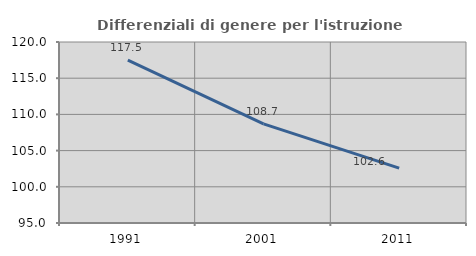
| Category | Differenziali di genere per l'istruzione superiore |
|---|---|
| 1991.0 | 117.499 |
| 2001.0 | 108.683 |
| 2011.0 | 102.571 |